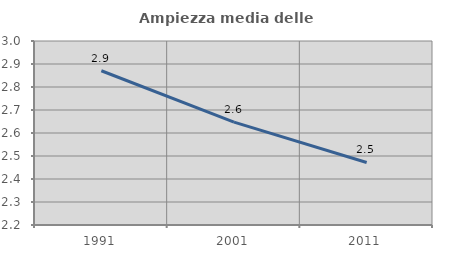
| Category | Ampiezza media delle famiglie |
|---|---|
| 1991.0 | 2.871 |
| 2001.0 | 2.647 |
| 2011.0 | 2.472 |